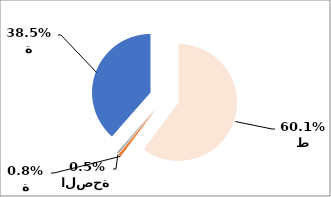
| Category | Series 0 |
|---|---|
| النفط | 6738454058 |
| الزراعة | 90739207 |
| الصحة | 56687086 |
| التجارة | 4317775414 |